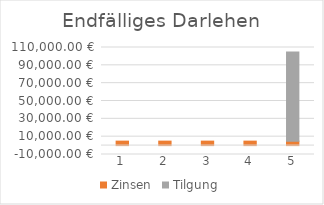
| Category | Zinsen | Tilgung |
|---|---|---|
| 0 | 5000 | 0 |
| 1 | 5000 | 0 |
| 2 | 5000 | 0 |
| 3 | 5000 | 0 |
| 4 | 5000 | 100000 |